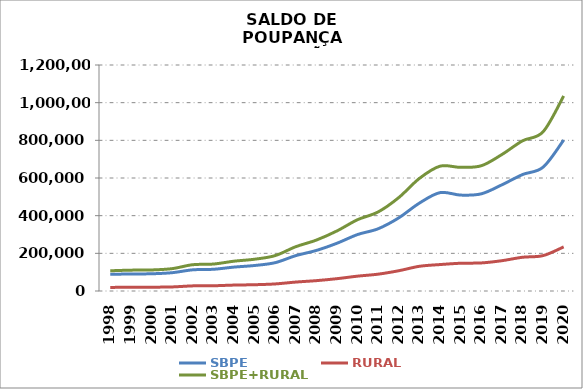
| Category | SBPE | RURAL | SBPE+RURAL |
|---|---|---|---|
| 1998 | 88538.349 | 18883.24 | 107421.589 |
| 1999 | 90437.74 | 20294.123 | 110731.863 |
| 2000 | 91430.45 | 20310.891 | 111741.341 |
| 2001 | 97146.25 | 21552.598 | 118698.848 |
| 2002 | 112423.444 | 27219.068 | 139642.512 |
| 2003 | 115258.021 | 27799.406 | 143057.427 |
| 2004 | 126853.217 | 31413.354 | 158266.571 |
| 2005 | 135411.681 | 33322.74 | 168734.421 |
| 2006 | 150412.546 | 37523.193 | 187935.739 |
| 2007 | 187827.264 | 47434.388 | 235261.652 |
| 2008 | 215400.282 | 54995.458 | 270395.74 |
| 2009 | 253604.98 | 65477.998 | 319082.978 |
| 2010 | 299878.217 | 78920.574 | 378798.791 |
| 2011 | 330569.272 | 89439.722 | 420008.994 |
| 2012 | 388641.662 | 107660.772 | 496302.434 |
| 2013 | 466788.644 | 131154.416 | 597943.06 |
| 2014 | 522343.501 | 140383.609 | 662727.11 |
| 2015 | 509223.044 | 147366.727 | 656589.771 |
| 2016 | 515955.43 | 149036.994 | 664992.424 |
| 2017 | 563741.675 | 160861.771 | 724603.446 |
| 2018 | 618146.063 | 179134.939 | 797281.002 |
| 2019 | 657531.442 | 187933.103 | 845464.545 |
| 2020 | 801437.985 | 234189.821 | 1035627.806 |